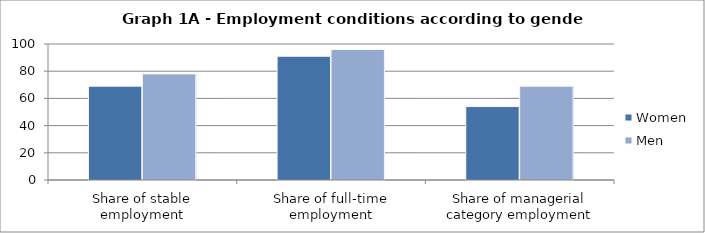
| Category | Women | Men |
|---|---|---|
| Share of stable employment | 69 | 78 |
| Share of full-time employment | 91 | 96 |
| Share of managerial category employment | 54 | 69 |